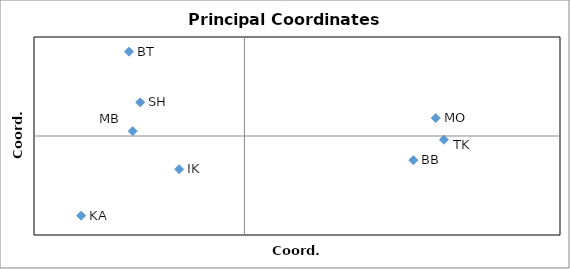
| Category | Series 0 |
|---|---|
| 0.0803048948100138 | -0.024 |
| 0.09094375145429207 | 0.018 |
| 0.094809259585804 | -0.004 |
| -0.05306357607320528 | 0.005 |
| -0.031011748189989145 | -0.034 |
| -0.07760187953650108 | -0.08 |
| -0.04951539593793172 | 0.034 |
| -0.05486530792208678 | 0.085 |